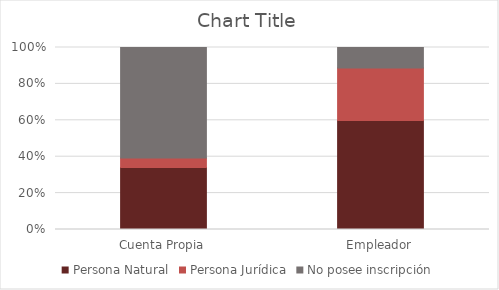
| Category | Persona Natural | Persona Jurídica | No posee inscripción |
|---|---|---|---|
| Cuenta Propia | 0.341 | 0.051 | 0.607 |
| Empleador | 0.599 | 0.289 | 0.112 |